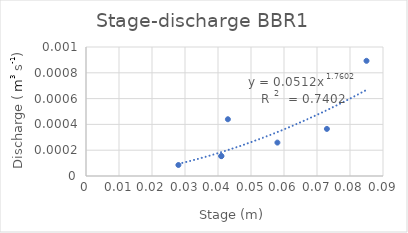
| Category | QA (m3/s) |
|---|---|
| 0.057999999999999996 | 0 |
| 0.027999999999999997 | 0 |
| 0.041 | 0 |
| 0.043 | 0 |
| 0.085 | 0.001 |
| 0.041 | 0 |
| 0.073 | 0 |